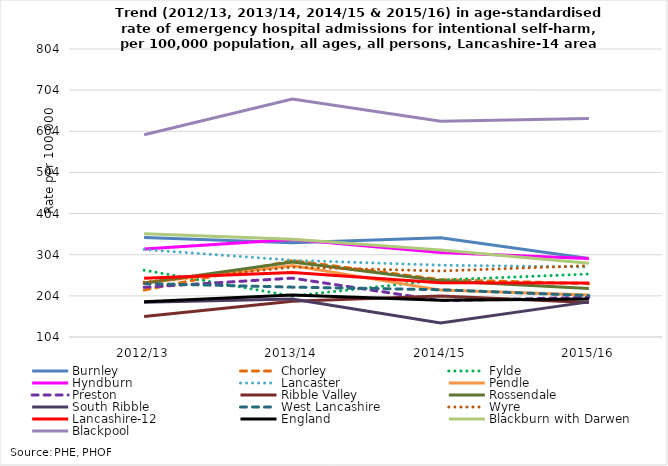
| Category | Burnley | Chorley | Fylde | Hyndburn | Lancaster | Pendle | Preston | Ribble Valley | Rossendale | South Ribble | West Lancashire | Wyre | Lancashire-12 | England | Blackburn with Darwen | Blackpool |
|---|---|---|---|---|---|---|---|---|---|---|---|---|---|---|---|---|
| 2012/13 | 345.855 | 218.246 | 266.304 | 317.594 | 316.63 | 234.964 | 224.895 | 153.803 | 235.097 | 188.622 | 233.951 | 237.159 | 246.781 | 189.569 | 354.917 | 595.574 |
| 2013/14 | 332.949 | 289.718 | 203.634 | 341.073 | 290.536 | 277.48 | 247.09 | 190.93 | 286.371 | 196.59 | 225.176 | 273.804 | 260.774 | 205.927 | 341.423 | 682.618 |
| 2014/15 | 345.065 | 243.423 | 242.69 | 309.453 | 278.622 | 217.95 | 192.474 | 203.753 | 240.503 | 138.006 | 218.908 | 264.416 | 236.076 | 193.235 | 315.733 | 628.424 |
| 2015/16 | 294.557 | 233.588 | 257.019 | 294.974 | 273.954 | 206.206 | 200.293 | 187.997 | 222.029 | 189.366 | 204.665 | 277.457 | 234.954 | 196.548 | 283.497 | 635.3 |